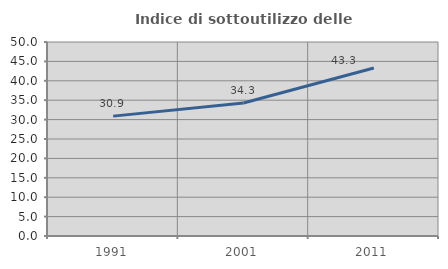
| Category | Indice di sottoutilizzo delle abitazioni  |
|---|---|
| 1991.0 | 30.896 |
| 2001.0 | 34.286 |
| 2011.0 | 43.307 |